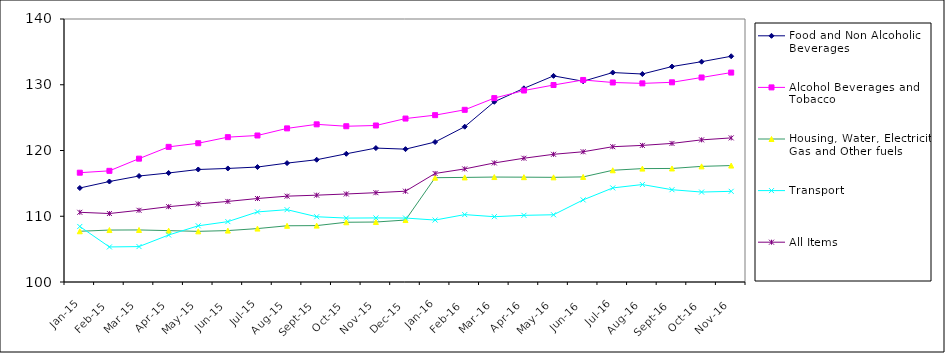
| Category | Food and Non Alcoholic Beverages | Alcohol Beverages and Tobacco | Housing, Water, Electricity, Gas and Other fuels | Transport | All Items  |
|---|---|---|---|---|---|
| 2015-01-01 | 114.295 | 116.625 | 107.716 | 108.446 | 110.601 |
| 2015-02-01 | 115.283 | 116.906 | 107.901 | 105.333 | 110.415 |
| 2015-03-01 | 116.12 | 118.76 | 107.917 | 105.386 | 110.906 |
| 2015-04-01 | 116.582 | 120.552 | 107.812 | 107.146 | 111.458 |
| 2015-05-01 | 117.112 | 121.107 | 107.704 | 108.548 | 111.873 |
| 2015-06-01 | 117.271 | 122.03 | 107.821 | 109.182 | 112.254 |
| 2015-07-01 | 117.484 | 122.282 | 108.124 | 110.66 | 112.699 |
| 2015-08-01 | 118.084 | 123.363 | 108.552 | 111 | 113.056 |
| 2015-09-01 | 118.596 | 123.979 | 108.577 | 109.926 | 113.205 |
| 2015-10-01 | 119.501 | 123.689 | 109.085 | 109.721 | 113.387 |
| 2015-11-01 | 120.368 | 123.804 | 109.122 | 109.744 | 113.581 |
| 2015-12-01 | 120.205 | 124.859 | 109.423 | 109.727 | 113.811 |
| 2016-01-01 | 121.29 | 125.378 | 115.867 | 109.421 | 116.507 |
| 2016-02-01 | 123.619 | 126.187 | 115.907 | 110.251 | 117.2 |
| 2016-03-01 | 127.409 | 127.97 | 115.962 | 109.932 | 118.108 |
| 2016-04-01 | 129.458 | 129.123 | 115.945 | 110.138 | 118.824 |
| 2016-05-01 | 131.348 | 129.958 | 115.918 | 110.226 | 119.421 |
| 2016-06-01 | 130.53 | 130.727 | 115.984 | 112.488 | 119.809 |
| 2016-07-01 | 131.856 | 130.344 | 116.993 | 114.308 | 120.576 |
| 2016-08-01 | 131.634 | 130.211 | 117.248 | 114.823 | 120.775 |
| 2016-09-01 | 132.768 | 130.37 | 117.267 | 114.035 | 121.078 |
| 2016-10-01 | 133.508 | 131.105 | 117.586 | 113.681 | 121.617 |
| 2016-11-01 | 134.333 | 131.852 | 117.711 | 113.793 | 121.917 |